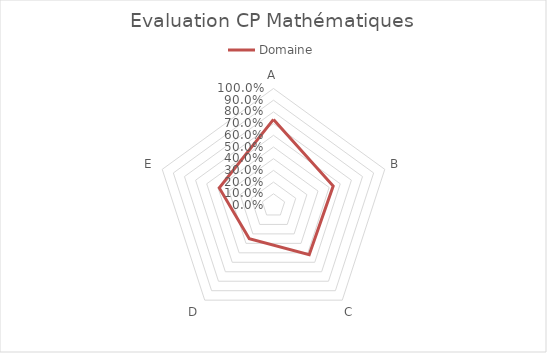
| Category | Domaine |
|---|---|
| A | 0.736 |
| B | 0.536 |
| C | 0.519 |
| D | 0.352 |
| E | 0.487 |